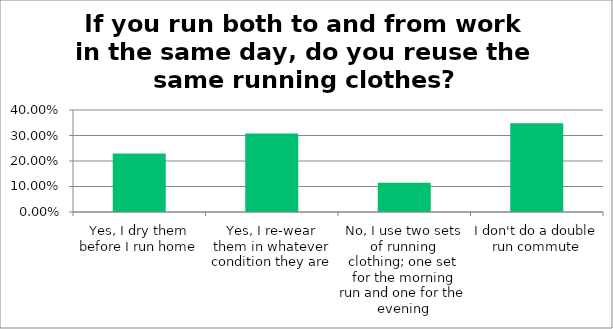
| Category | Responses |
|---|---|
| Yes, I dry them before I run home | 0.23 |
| Yes, I re-wear them in whatever condition they are | 0.307 |
| No, I use two sets of running clothing; one set for the morning run and one for the evening | 0.115 |
| I don't do a double run commute | 0.348 |